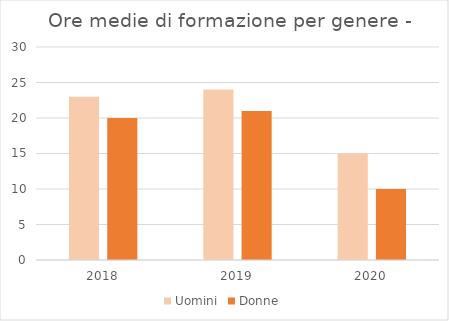
| Category | Uomini | Donne |
|---|---|---|
| 2018.0 | 23 | 20 |
| 2019.0 | 24 | 21 |
| 2020.0 | 15 | 10 |